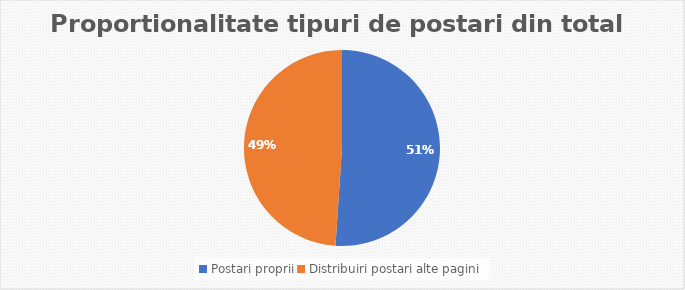
| Category | Series 0 |
|---|---|
| Postari proprii | 120 |
| Distribuiri postari alte pagini | 115 |